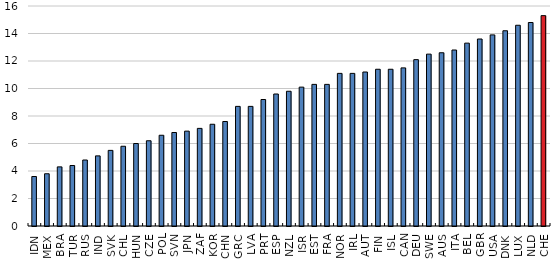
| Category | Percentage of publications among 10% most-cited, 2015 |
|---|---|
| IDN | 3.6 |
| MEX | 3.8 |
| BRA | 4.3 |
| TUR | 4.4 |
| RUS | 4.8 |
| IND | 5.1 |
| SVK | 5.5 |
| CHL | 5.8 |
| HUN | 6 |
| CZE | 6.2 |
| POL | 6.6 |
| SVN | 6.8 |
| JPN | 6.9 |
| ZAF | 7.1 |
| KOR | 7.4 |
| CHN | 7.6 |
| GRC | 8.7 |
| LVA | 8.7 |
| PRT | 9.2 |
| ESP | 9.6 |
| NZL | 9.8 |
| ISR | 10.1 |
| EST | 10.3 |
| FRA | 10.3 |
| NOR | 11.1 |
| IRL | 11.1 |
| AUT | 11.2 |
| FIN | 11.4 |
| ISL | 11.4 |
| CAN | 11.5 |
| DEU | 12.1 |
| SWE | 12.5 |
| AUS | 12.6 |
| ITA | 12.8 |
| BEL | 13.3 |
| GBR | 13.6 |
| USA | 13.9 |
| DNK | 14.2 |
| LUX | 14.6 |
| NLD | 14.8 |
| CHE | 15.3 |